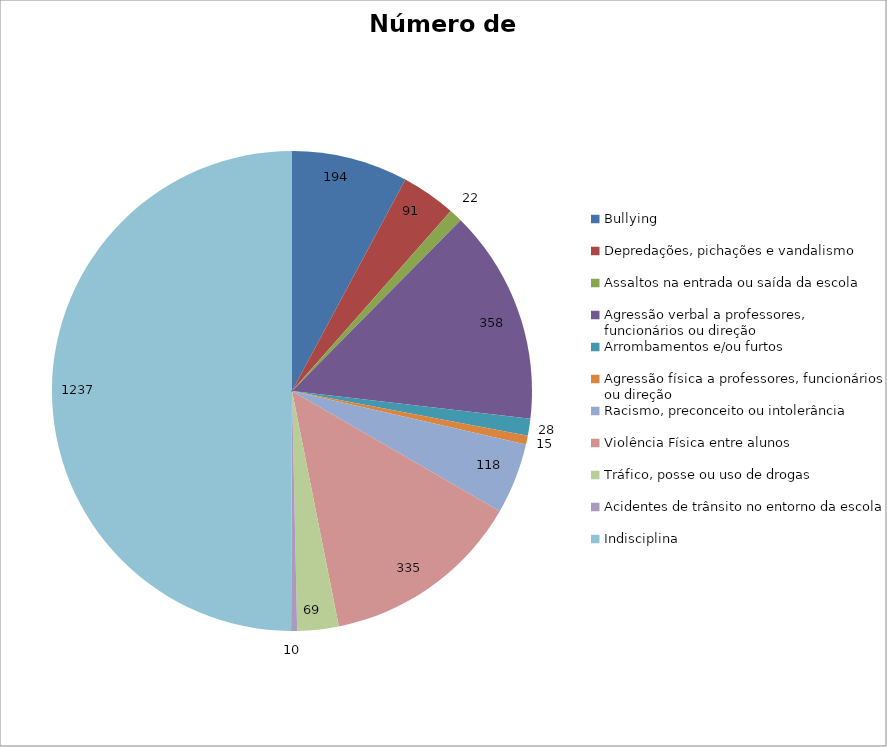
| Category | Número de Casos |
|---|---|
| Bullying | 194 |
| Depredações, pichações e vandalismo | 91 |
| Assaltos na entrada ou saída da escola | 22 |
| Agressão verbal a professores, funcionários ou direção | 358 |
| Arrombamentos e/ou furtos | 28 |
| Agressão física a professores, funcionários ou direção | 15 |
| Racismo, preconceito ou intolerância | 118 |
| Violência Física entre alunos | 335 |
| Tráfico, posse ou uso de drogas | 69 |
| Acidentes de trânsito no entorno da escola | 10 |
| Indisciplina | 1237 |